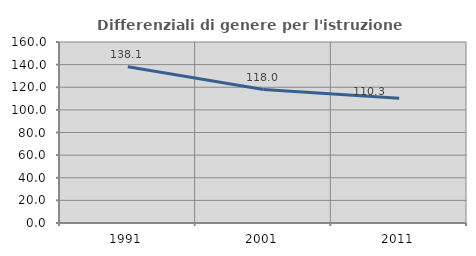
| Category | Differenziali di genere per l'istruzione superiore |
|---|---|
| 1991.0 | 138.125 |
| 2001.0 | 117.963 |
| 2011.0 | 110.342 |